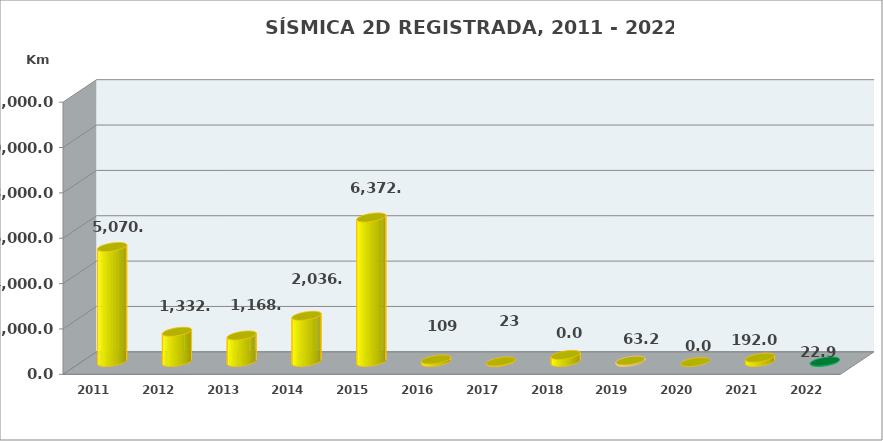
| Category | Series 0 |
|---|---|
| 2011.0 | 5070.18 |
| 2012.0 | 1332.85 |
| 2013.0 | 1168 |
| 2014.0 | 2036 |
| 2015.0 | 6372.61 |
| 2016.0 | 109 |
| 2017.0 | 22.92 |
| 2018.0 | 313.4 |
| 2019.0 | 63.22 |
| 2020.0 | 0 |
| 2021.0 | 191.95 |
| 2022.0 | 22.92 |